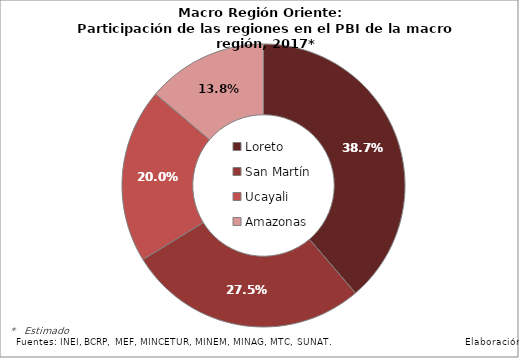
| Category | Series 0 |
|---|---|
| Loreto | 0.387 |
| San Martín | 0.275 |
| Ucayali | 0.2 |
| Amazonas | 0.138 |